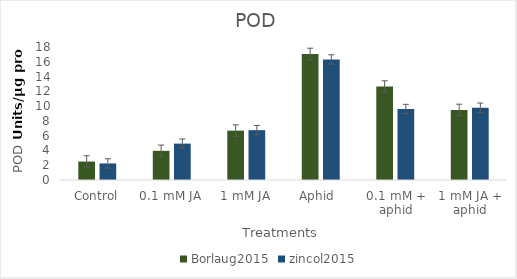
| Category | Borlaug2015 | zincol2015 |
|---|---|---|
| Control | 2.498 | 2.241 |
| 0.1 mM JA | 3.949 | 4.922 |
| 1 mM JA | 6.681 | 6.746 |
| Aphid  | 17.057 | 16.318 |
| 0.1 mM + aphid | 12.645 | 9.607 |
| 1 mM JA + aphid | 9.48 | 9.78 |